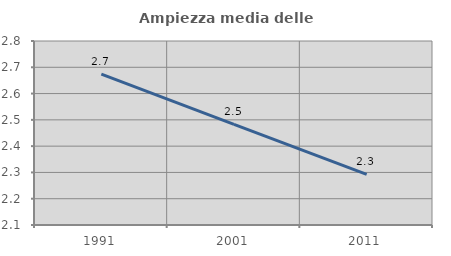
| Category | Ampiezza media delle famiglie |
|---|---|
| 1991.0 | 2.674 |
| 2001.0 | 2.483 |
| 2011.0 | 2.292 |